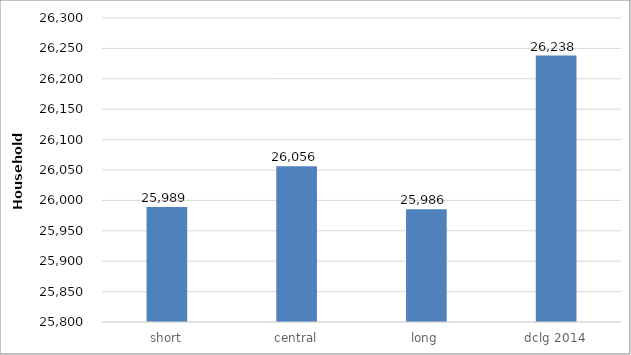
| Category | annualised |
|---|---|
| short | 25989.261 |
| central | 26056.349 |
| long | 25985.549 |
| dclg 2014 | 26238.283 |